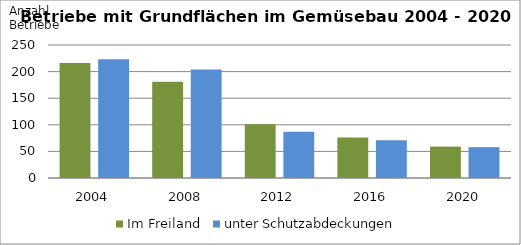
| Category | Im Freiland | unter Schutzabdeckungen |
|---|---|---|
| 2004.0 | 216 | 223 |
| 2008.0 | 181 | 204 |
| 2012.0 | 101 | 87 |
| 2016.0 | 76 | 71 |
| 2020.0 | 59 | 58 |